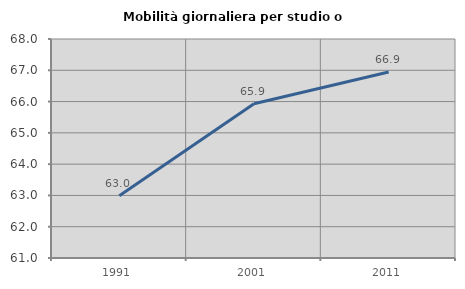
| Category | Mobilità giornaliera per studio o lavoro |
|---|---|
| 1991.0 | 62.989 |
| 2001.0 | 65.932 |
| 2011.0 | 66.944 |